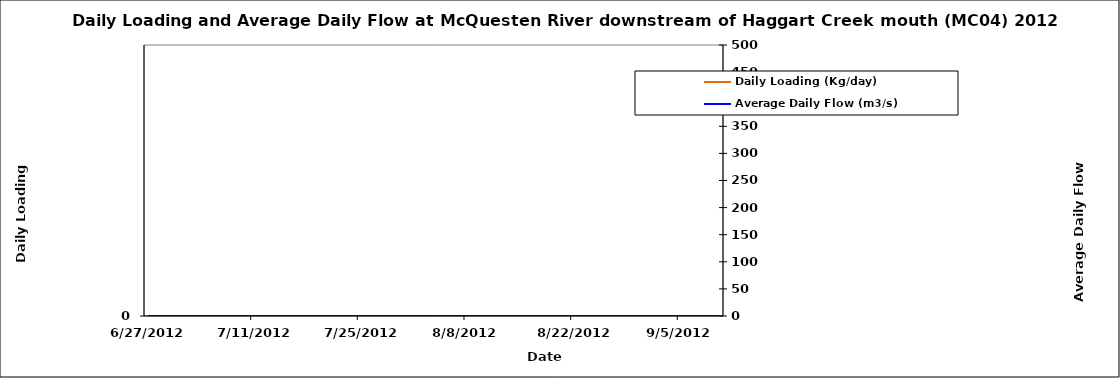
| Category | Daily Loading (Kg/day) |
|---|---|
| 41087.0 | 0 |
| 41088.0 | 0 |
| 41089.0 | 0 |
| 41090.0 | 0 |
| 41091.0 | 0 |
| 41092.0 | 0 |
| 41093.0 | 0 |
| 41094.0 | 0 |
| 41095.0 | 0 |
| 41096.0 | 0 |
| 41097.0 | 0 |
| 41098.0 | 0 |
| 41099.0 | 0 |
| 41100.0 | 0 |
| 41101.0 | 0 |
| 41102.0 | 0 |
| 41103.0 | 0 |
| 41104.0 | 0 |
| 41105.0 | 0 |
| 41106.0 | 0 |
| 41107.0 | 0 |
| 41108.0 | 0 |
| 41109.0 | 0 |
| 41110.0 | 0 |
| 41117.0 | 0 |
| 41118.0 | 0 |
| 41119.0 | 0 |
| 41120.0 | 0 |
| 41121.0 | 0 |
| 41122.0 | 0 |
| 41123.0 | 0 |
| 41124.0 | 0 |
| 41125.0 | 0 |
| 41126.0 | 0 |
| 41127.0 | 0 |
| 41128.0 | 0 |
| 41129.0 | 0 |
| 41130.0 | 0 |
| 41131.0 | 0 |
| 41132.0 | 0 |
| 41133.0 | 0 |
| 41134.0 | 0 |
| 41135.0 | 0 |
| 41136.0 | 0 |
| 41137.0 | 0 |
| 41138.0 | 0 |
| 41139.0 | 0 |
| 41139.0 | 0 |
| 41140.0 | 0 |
| 41140.0 | 0 |
| 41141.0 | 0 |
| 41142.0 | 0 |
| 41143.0 | 0 |
| 41144.0 | 0 |
| 41145.0 | 0 |
| 41146.0 | 0 |
| 41147.0 | 0 |
| 41148.0 | 0 |
| 41149.0 | 0 |
| 41150.0 | 0 |
| 41151.0 | 0 |
| 41152.0 | 0 |
| 41153.0 | 0 |
| 41154.0 | 0 |
| 41155.0 | 0 |
| 41156.0 | 0 |
| 41157.0 | 0 |
| 41158.0 | 0 |
| 41159.0 | 0 |
| 41160.0 | 0 |
| 41161.0 | 0 |
| 41162.0 | 0 |